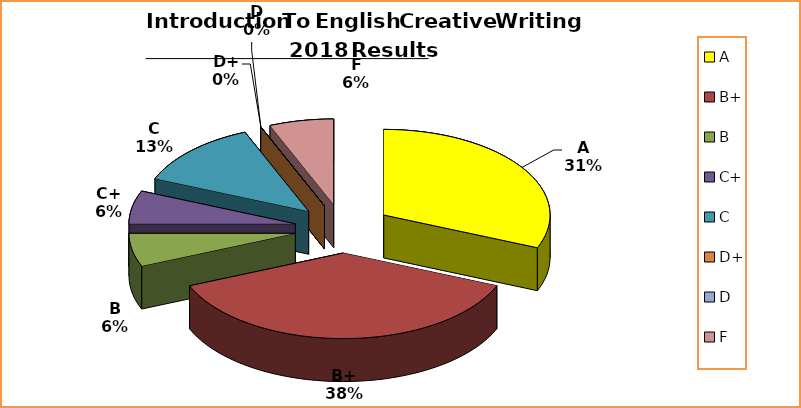
| Category | Series 0 |
|---|---|
| A | 5 |
| B+ | 6 |
| B | 1 |
| C+ | 1 |
| C | 2 |
| D+ | 0 |
| D | 0 |
| F | 1 |